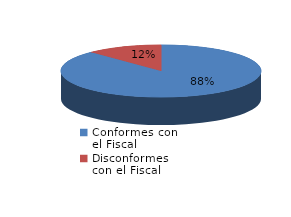
| Category | Series 0 |
|---|---|
| 0 | 3866 |
| 1 | 541 |